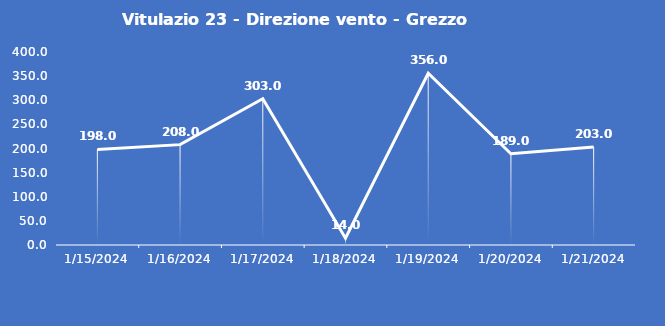
| Category | Vitulazio 23 - Direzione vento - Grezzo (°N) |
|---|---|
| 1/15/24 | 198 |
| 1/16/24 | 208 |
| 1/17/24 | 303 |
| 1/18/24 | 14 |
| 1/19/24 | 356 |
| 1/20/24 | 189 |
| 1/21/24 | 203 |